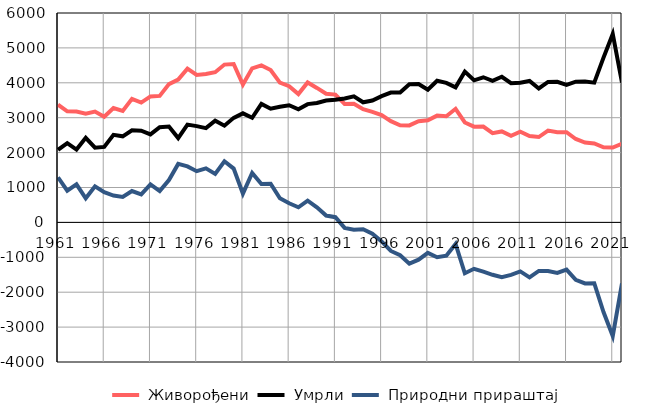
| Category |  Живорођени |  Умрли |  Природни прираштај |
|---|---|---|---|
| 1961.0 | 3373 | 2080 | 1293 |
| 1962.0 | 3183 | 2272 | 911 |
| 1963.0 | 3179 | 2087 | 1092 |
| 1964.0 | 3116 | 2425 | 691 |
| 1965.0 | 3175 | 2141 | 1034 |
| 1966.0 | 3027 | 2163 | 864 |
| 1967.0 | 3278 | 2508 | 770 |
| 1968.0 | 3196 | 2466 | 730 |
| 1969.0 | 3539 | 2641 | 898 |
| 1970.0 | 3433 | 2628 | 805 |
| 1971.0 | 3610 | 2521 | 1089 |
| 1972.0 | 3624 | 2728 | 896 |
| 1973.0 | 3963 | 2749 | 1214 |
| 1974.0 | 4091 | 2415 | 1676 |
| 1975.0 | 4406 | 2801 | 1605 |
| 1976.0 | 4226 | 2758 | 1468 |
| 1977.0 | 4250 | 2700 | 1550 |
| 1978.0 | 4303 | 2913 | 1390 |
| 1979.0 | 4522 | 2771 | 1751 |
| 1980.0 | 4538 | 2996 | 1542 |
| 1981.0 | 3950 | 3125 | 825 |
| 1982.0 | 4415 | 2997 | 1418 |
| 1983.0 | 4497 | 3396 | 1101 |
| 1984.0 | 4366 | 3257 | 1109 |
| 1985.0 | 4003 | 3314 | 689 |
| 1986.0 | 3904 | 3357 | 547 |
| 1987.0 | 3676 | 3243 | 433 |
| 1988.0 | 4011 | 3389 | 622 |
| 1989.0 | 3853 | 3420 | 433 |
| 1990.0 | 3686 | 3490 | 196 |
| 1991.0 | 3661 | 3512 | 149 |
| 1992.0 | 3396 | 3552 | -156 |
| 1993.0 | 3402 | 3610 | -208 |
| 1994.0 | 3244 | 3441 | -197 |
| 1995.0 | 3166 | 3491 | -325 |
| 1996.0 | 3073 | 3618 | -545 |
| 1997.0 | 2902 | 3720 | -818 |
| 1998.0 | 2783 | 3725 | -942 |
| 1999.0 | 2779 | 3961 | -1182 |
| 2000.0 | 2898 | 3967 | -1069 |
| 2001.0 | 2928 | 3800 | -872 |
| 2002.0 | 3060 | 4059 | -999 |
| 2003.0 | 3043 | 3999 | -956 |
| 2004.0 | 3255 | 3871 | -616 |
| 2005.0 | 2863 | 4320 | -1457 |
| 2006.0 | 2743 | 4072 | -1329 |
| 2007.0 | 2746 | 4159 | -1413 |
| 2008.0 | 2557 | 4058 | -1501 |
| 2009.0 | 2606 | 4173 | -1567 |
| 2010.0 | 2483 | 3987 | -1504 |
| 2011.0 | 2597 | 4002 | -1405 |
| 2012.0 | 2477 | 4052 | -1575 |
| 2013.0 | 2446 | 3837 | -1391 |
| 2014.0 | 2629 | 4025 | -1396 |
| 2015.0 | 2581 | 4029 | -1448 |
| 2016.0 | 2586 | 3939 | -1353 |
| 2017.0 | 2390 | 4033 | -1643 |
| 2018.0 | 2287 | 4035 | -1748 |
| 2019.0 | 2263 | 4005 | -1742 |
| 2020.0 | 2150 | 4720 | -2570 |
| 2021.0 | 2144 | 5399 | -3255 |
| 2022.0 | 2257 | 4006 | -1749 |